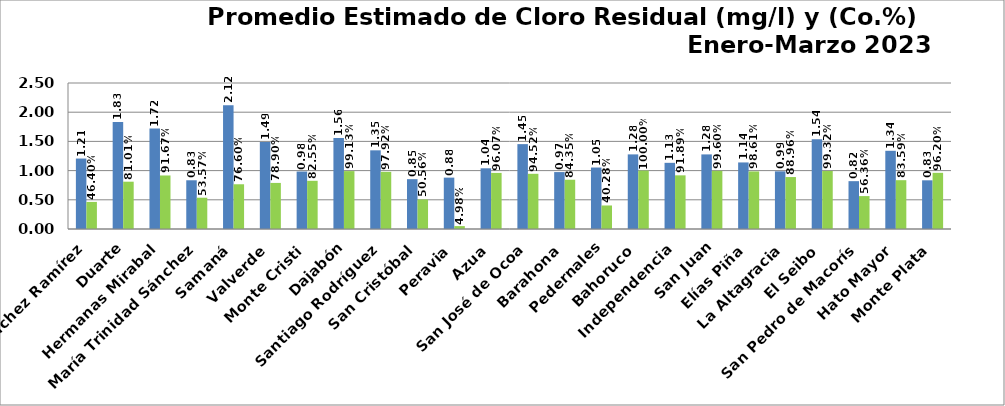
| Category | PROMEDIO TRIMESTRAL (mg/l) | PROMEDIO TRIMESTRAL (Co.%) |
|---|---|---|
| Sánchez Ramírez | 1.206 | 0.464 |
| Duarte | 1.832 | 0.81 |
| Hermanas Mirabal | 1.72 | 0.917 |
| María Trinidad Sánchez | 0.834 | 0.536 |
| Samaná | 2.121 | 0.766 |
| Valverde | 1.489 | 0.789 |
| Monte Cristi | 0.984 | 0.825 |
| Dajabón | 1.556 | 0.991 |
| Santiago Rodríguez | 1.347 | 0.979 |
| San Cristóbal | 0.853 | 0.506 |
| Peravia | 0.88 | 0.05 |
| Azua | 1.04 | 0.961 |
| San José de Ocoa | 1.453 | 0.945 |
| Barahona | 0.975 | 0.843 |
| Pedernales | 1.052 | 0.403 |
| Bahoruco | 1.278 | 1 |
| Independencia | 1.133 | 0.919 |
| San Juan | 1.277 | 0.996 |
| Elías Piña | 1.14 | 0.986 |
| La Altagracia | 0.987 | 0.89 |
| El Seibo | 1.538 | 0.993 |
| San Pedro de Macorís | 0.819 | 0.564 |
| Hato Mayor | 1.339 | 0.836 |
| Monte Plata | 0.834 | 0.962 |